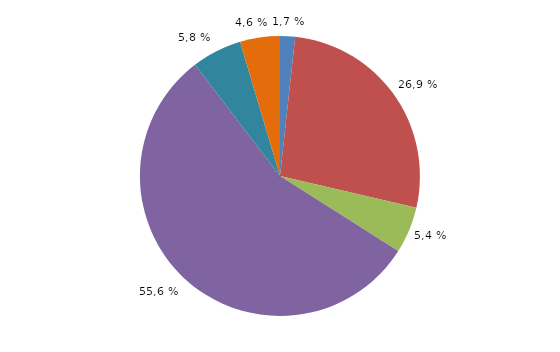
| Category | Series 0 |
|---|---|
| Selbständige | 368 |
| Arbeitnehmer (Arbeiter, Angestellte, Beamte) | 5714 |
| Arbeitslose | 1138 |
| Rentner, Pensionäre | 11819 |
| Studierende, Auszubildende mit Einkommen nach § 14 Absatz 2 Nummern 27-29 WoGG | 1228 |
| sonstige | 978 |